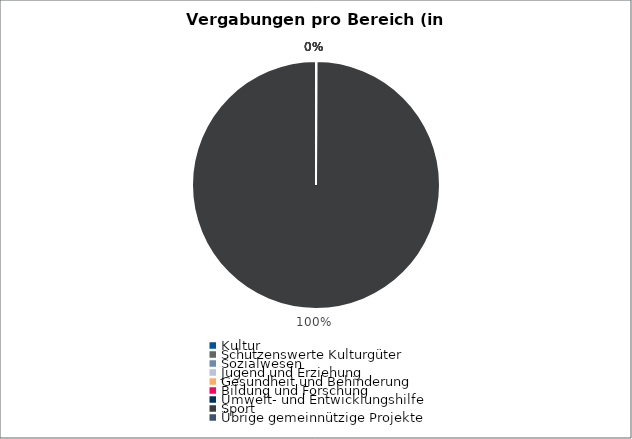
| Category | Series 0 |
|---|---|
| Kultur | 0 |
| Schützenswerte Kulturgüter | 0 |
| Sozialwesen | 0 |
| Jugend und Erziehung | 0 |
| Gesundheit und Behinderung | 0 |
| Bildung und Forschung | 0 |
| Umwelt- und Entwicklungshilfe | 0 |
| Sport | 573039 |
| Übrige gemeinnützige Projekte | 0 |